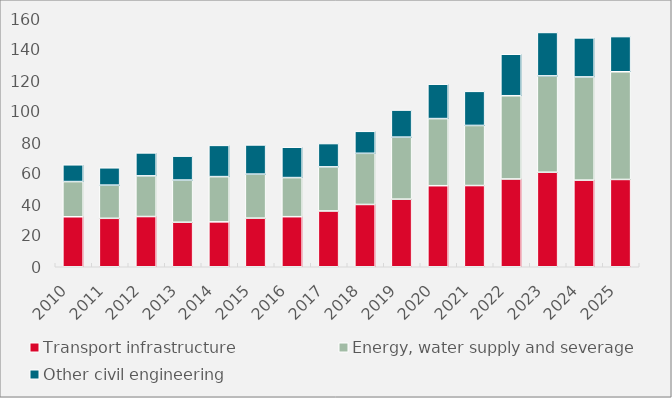
| Category | Transport infrastructure | Energy, water supply and severage | Other civil engineering |
|---|---|---|---|
| 2010.0 | 32.254 | 22.702 | 10.824 |
| 2011.0 | 31.255 | 21.405 | 11.19 |
| 2012.0 | 32.403 | 26.24 | 14.8 |
| 2013.0 | 28.712 | 27.224 | 15.44 |
| 2014.0 | 28.959 | 29.188 | 20.155 |
| 2015.0 | 31.362 | 28.403 | 18.824 |
| 2016.0 | 32.307 | 25.223 | 19.578 |
| 2017.0 | 35.995 | 28.441 | 15.042 |
| 2018.0 | 40.187 | 33.008 | 14.177 |
| 2019.0 | 43.613 | 40.014 | 17.461 |
| 2020.0 | 52.289 | 43.299 | 22.182 |
| 2021.0 | 52.389 | 38.78 | 21.987 |
| 2022.0 | 56.631 | 53.705 | 26.77 |
| 2023.0 | 60.979 | 62.165 | 28.009 |
| 2024.0 | 55.896 | 66.579 | 25.171 |
| 2025.0 | 56.323 | 69.48 | 22.704 |